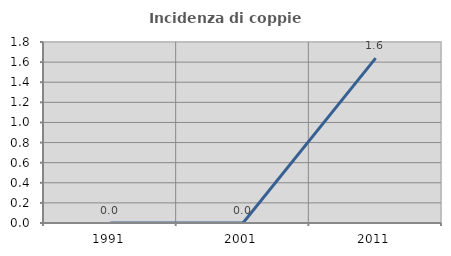
| Category | Incidenza di coppie miste |
|---|---|
| 1991.0 | 0 |
| 2001.0 | 0 |
| 2011.0 | 1.639 |